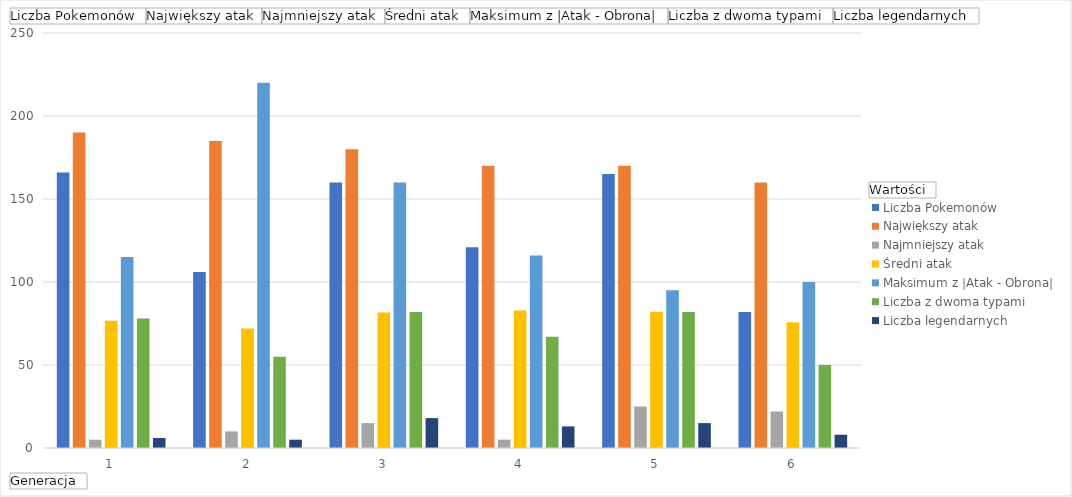
| Category | Liczba Pokemonów | Największy atak | Najmniejszy atak | Średni atak | Maksimum z |Atak - Obrona| | Liczba z dwoma typami | Liczba legendarnych |
|---|---|---|---|---|---|---|---|
| 1 | 166 | 190 | 5 | 76.639 | 115 | 78 | 6 |
| 2 | 106 | 185 | 10 | 72.028 | 220 | 55 | 5 |
| 3 | 160 | 180 | 15 | 81.625 | 160 | 82 | 18 |
| 4 | 121 | 170 | 5 | 82.868 | 116 | 67 | 13 |
| 5 | 165 | 170 | 25 | 82.067 | 95 | 82 | 15 |
| 6 | 82 | 160 | 22 | 75.805 | 100 | 50 | 8 |